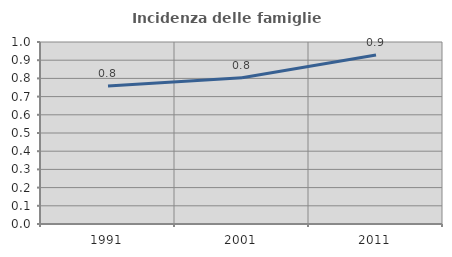
| Category | Incidenza delle famiglie numerose |
|---|---|
| 1991.0 | 0.759 |
| 2001.0 | 0.804 |
| 2011.0 | 0.929 |